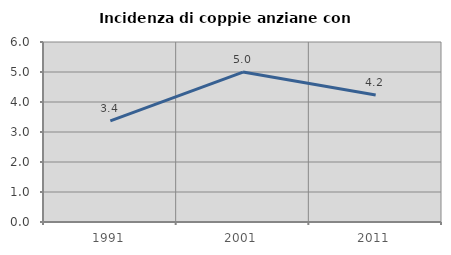
| Category | Incidenza di coppie anziane con figli |
|---|---|
| 1991.0 | 3.371 |
| 2001.0 | 4.997 |
| 2011.0 | 4.233 |